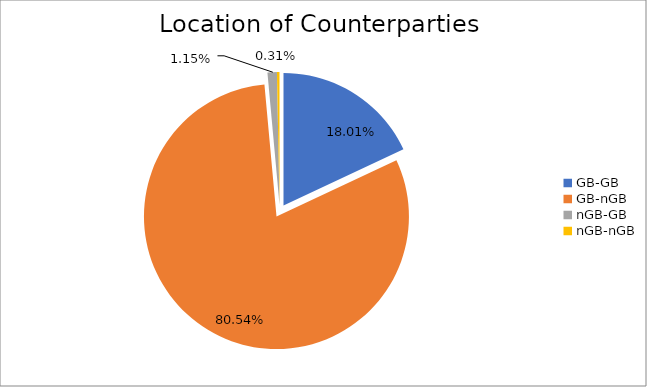
| Category | Series 0 |
|---|---|
| GB-GB | 1704544.445 |
| GB-nGB | 7623839.661 |
| nGB-GB | 108406.299 |
| nGB-nGB | 29114.419 |